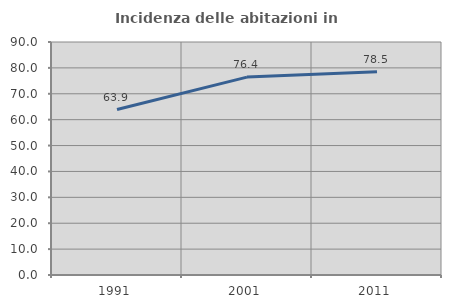
| Category | Incidenza delle abitazioni in proprietà  |
|---|---|
| 1991.0 | 63.912 |
| 2001.0 | 76.446 |
| 2011.0 | 78.527 |